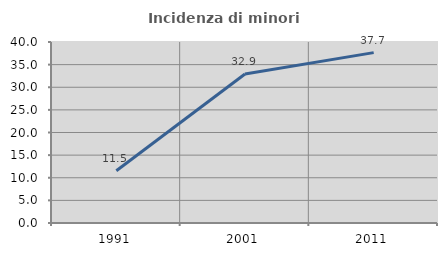
| Category | Incidenza di minori stranieri |
|---|---|
| 1991.0 | 11.538 |
| 2001.0 | 32.934 |
| 2011.0 | 37.654 |